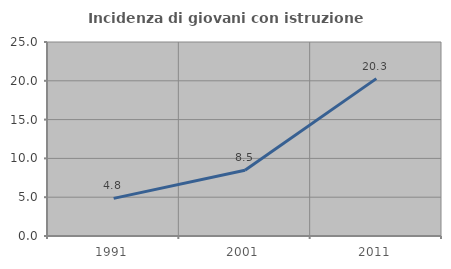
| Category | Incidenza di giovani con istruzione universitaria |
|---|---|
| 1991.0 | 4.848 |
| 2001.0 | 8.462 |
| 2011.0 | 20.278 |